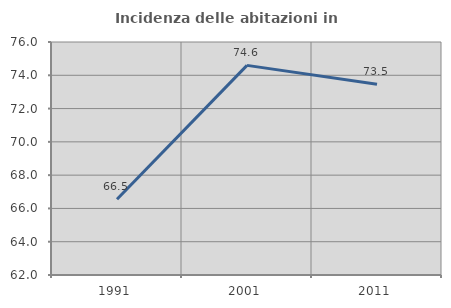
| Category | Incidenza delle abitazioni in proprietà  |
|---|---|
| 1991.0 | 66.549 |
| 2001.0 | 74.596 |
| 2011.0 | 73.459 |